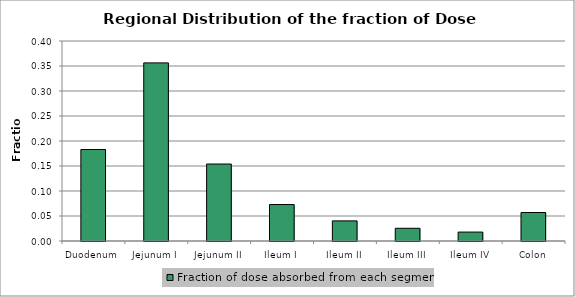
| Category | Fraction of dose absorbed from each segment |
|---|---|
| Duodenum | 0.183 |
| Jejunum I | 0.356 |
| Jejunum II | 0.154 |
| Ileum I | 0.073 |
| Ileum II | 0.04 |
| Ileum III | 0.025 |
| Ileum IV | 0.018 |
| Colon | 0.057 |